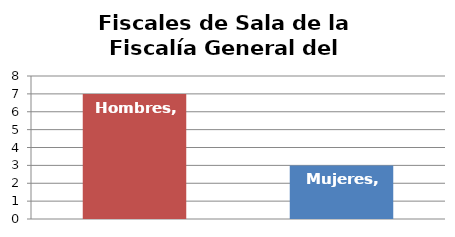
| Category | Fiscales de Sala de la Fiscalía General del Estado |
|---|---|
| Hombres | 7 |
| Mujeres | 3 |